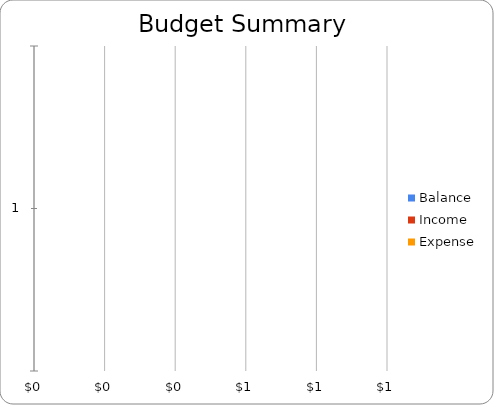
| Category | Balance | Income | Expense |
|---|---|---|---|
| 0 | 0 | 0 | 0 |